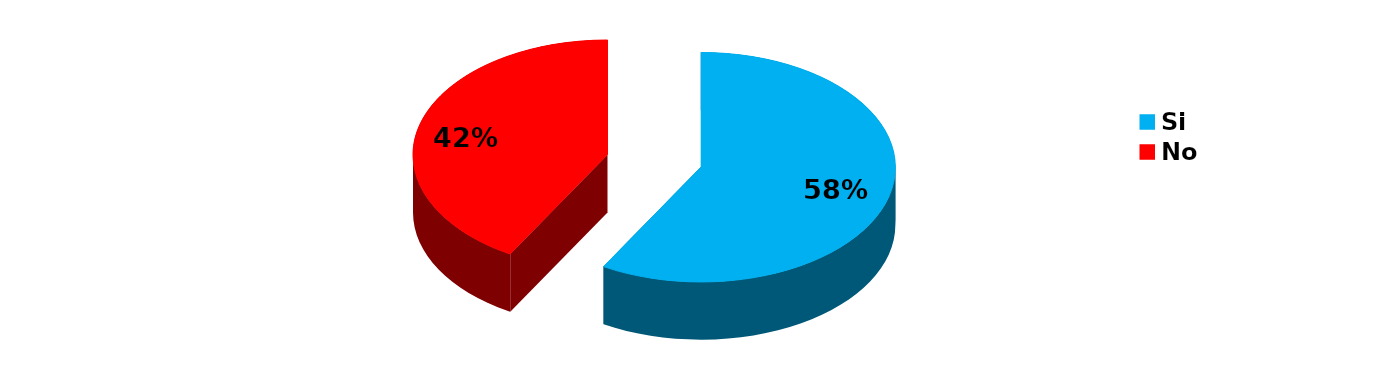
| Category | Series 0 |
|---|---|
| Si | 7 |
| No | 5 |